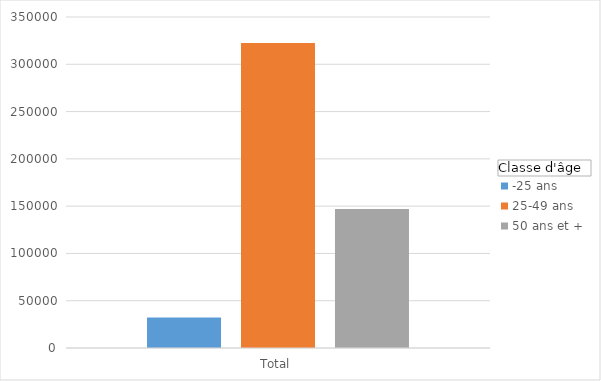
| Category | -25 ans | 25-49 ans | 50 ans et + |
|---|---|---|---|
| Total | 32332 | 322385 | 146984 |